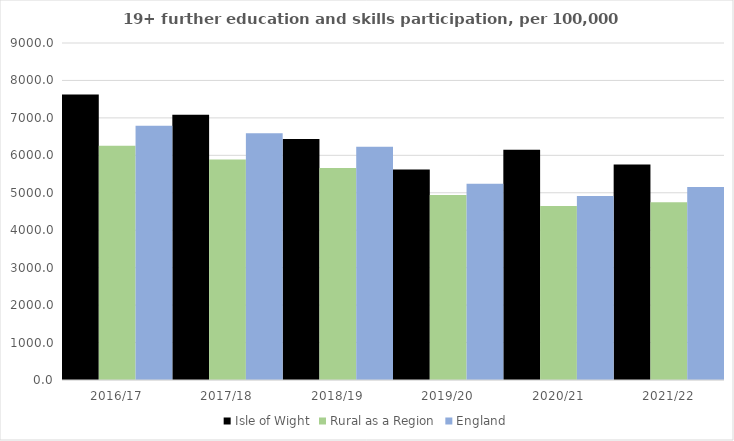
| Category | Isle of Wight | Rural as a Region | England |
|---|---|---|---|
| 2016/17 | 7625 | 6253.401 | 6788 |
| 2017/18 | 7081 | 5892.029 | 6588 |
| 2018/19 | 6439 | 5661.873 | 6227 |
| 2019/20 | 5621 | 4943.801 | 5244 |
| 2020/21 | 6150 | 4646.727 | 4913 |
| 2021/22 | 5755 | 4747.049 | 5151 |